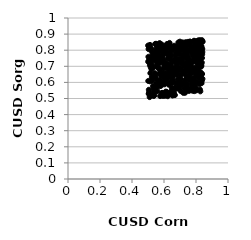
| Category | Series 0 |
|---|---|
| 0.789537141163253 | 0.546 |
| 0.7393209278989524 | 0.582 |
| 0.5146972384262045 | 0.657 |
| 0.8025821466182872 | 0.675 |
| 0.7553423103545773 | 0.713 |
| 0.6518374552992151 | 0.551 |
| 0.716653761533334 | 0.749 |
| 0.7913280189907017 | 0.842 |
| 0.5979593884945443 | 0.724 |
| 0.6924302068703907 | 0.794 |
| 0.6721062809417795 | 0.693 |
| 0.6343633907560136 | 0.784 |
| 0.7126194483507063 | 0.812 |
| 0.5954020792871302 | 0.658 |
| 0.7838053251334289 | 0.769 |
| 0.5831548302153797 | 0.641 |
| 0.6665365841519753 | 0.728 |
| 0.5408568572932027 | 0.774 |
| 0.7822607365205054 | 0.669 |
| 0.5972532858750963 | 0.739 |
| 0.5687135410672672 | 0.69 |
| 0.8086954234759687 | 0.732 |
| 0.6833786474103468 | 0.825 |
| 0.575823483311674 | 0.515 |
| 0.7512775900678096 | 0.564 |
| 0.5157013543859263 | 0.804 |
| 0.6257720732143637 | 0.748 |
| 0.6489855045192885 | 0.566 |
| 0.6496880024415178 | 0.55 |
| 0.643625241038317 | 0.712 |
| 0.8337201559222865 | 0.706 |
| 0.7409492055369735 | 0.594 |
| 0.6217054554742861 | 0.829 |
| 0.7963768174862137 | 0.557 |
| 0.7535535987557852 | 0.714 |
| 0.6586420130550489 | 0.658 |
| 0.807680028695077 | 0.64 |
| 0.7996050523855961 | 0.693 |
| 0.5791963725857388 | 0.761 |
| 0.7899514284050327 | 0.558 |
| 0.6170863241183342 | 0.539 |
| 0.696999464018413 | 0.774 |
| 0.8108554417359185 | 0.722 |
| 0.5592521472254736 | 0.546 |
| 0.673407103201527 | 0.782 |
| 0.6364854366401308 | 0.815 |
| 0.8019023742772847 | 0.55 |
| 0.7017172402778769 | 0.578 |
| 0.682590820111384 | 0.818 |
| 0.8255507794949901 | 0.737 |
| 0.7270235156668525 | 0.6 |
| 0.5835508032848437 | 0.823 |
| 0.5480344765651697 | 0.542 |
| 0.590976132361733 | 0.82 |
| 0.5080178996267478 | 0.743 |
| 0.5213319708328319 | 0.803 |
| 0.5585170846697625 | 0.732 |
| 0.727219435900885 | 0.823 |
| 0.8247338158405075 | 0.556 |
| 0.6407434502436964 | 0.762 |
| 0.7399629861713787 | 0.622 |
| 0.8203378696219645 | 0.64 |
| 0.5749204074095717 | 0.831 |
| 0.6471009726955761 | 0.613 |
| 0.5258403186809127 | 0.61 |
| 0.6884872854444603 | 0.572 |
| 0.7778725840772602 | 0.821 |
| 0.7719403527171453 | 0.655 |
| 0.7857166333493164 | 0.591 |
| 0.6579228734268394 | 0.602 |
| 0.7614068246514567 | 0.704 |
| 0.6230047715944955 | 0.778 |
| 0.7730864565297618 | 0.59 |
| 0.7591578467960547 | 0.613 |
| 0.6450855435140814 | 0.681 |
| 0.6286691533007386 | 0.535 |
| 0.747986817526133 | 0.705 |
| 0.7959635419356264 | 0.856 |
| 0.5195048153118826 | 0.811 |
| 0.5660370532559245 | 0.77 |
| 0.5093421625427896 | 0.735 |
| 0.7877308143223478 | 0.822 |
| 0.5674634064427115 | 0.809 |
| 0.5613703026136772 | 0.756 |
| 0.5719420304504657 | 0.72 |
| 0.5675779671727499 | 0.603 |
| 0.8322778754209412 | 0.65 |
| 0.5765796773158051 | 0.829 |
| 0.6253366417877969 | 0.635 |
| 0.7154265294037168 | 0.811 |
| 0.5016962133848333 | 0.609 |
| 0.7712719926138032 | 0.806 |
| 0.7572323442549609 | 0.841 |
| 0.8345911046278203 | 0.595 |
| 0.5860378547236758 | 0.835 |
| 0.8224486327946388 | 0.847 |
| 0.6418075506634328 | 0.529 |
| 0.724220812300675 | 0.836 |
| 0.6787454511188613 | 0.789 |
| 0.7333125306797498 | 0.696 |
| 0.5228472771427579 | 0.705 |
| 0.6760243627180262 | 0.687 |
| 0.543372627101915 | 0.633 |
| 0.7576616174536694 | 0.667 |
| 0.713827252726047 | 0.772 |
| 0.6300923187554525 | 0.586 |
| 0.7904861337532192 | 0.599 |
| 0.7247234132525657 | 0.669 |
| 0.6359512200970323 | 0.706 |
| 0.5555859263387691 | 0.823 |
| 0.6768518473513807 | 0.799 |
| 0.7632916115194517 | 0.679 |
| 0.8361713561107815 | 0.61 |
| 0.7186095118210329 | 0.707 |
| 0.7826198001580864 | 0.788 |
| 0.5738240237371401 | 0.607 |
| 0.522229076433828 | 0.68 |
| 0.7436753682812365 | 0.806 |
| 0.5694467603981398 | 0.594 |
| 0.5233217223801523 | 0.706 |
| 0.6055794496710558 | 0.517 |
| 0.8259875826886454 | 0.768 |
| 0.5546883763017978 | 0.83 |
| 0.6970743407092577 | 0.736 |
| 0.7566165155017609 | 0.636 |
| 0.7992659975486164 | 0.6 |
| 0.7196651382184569 | 0.661 |
| 0.8271957800808887 | 0.544 |
| 0.6426070367800769 | 0.825 |
| 0.6394822772287416 | 0.634 |
| 0.7626421155655152 | 0.854 |
| 0.734411382934531 | 0.801 |
| 0.5534244408105516 | 0.702 |
| 0.8281919239707146 | 0.597 |
| 0.7088443723876972 | 0.809 |
| 0.8199861684290868 | 0.775 |
| 0.6401429103923447 | 0.77 |
| 0.7025045353921959 | 0.602 |
| 0.746728014880554 | 0.729 |
| 0.7581663571935776 | 0.733 |
| 0.7507911358505414 | 0.852 |
| 0.6372755305705395 | 0.744 |
| 0.7173810607794494 | 0.659 |
| 0.7935086587236646 | 0.607 |
| 0.7149317985403314 | 0.73 |
| 0.6154269675054836 | 0.532 |
| 0.7361277163643768 | 0.85 |
| 0.6131144084233837 | 0.704 |
| 0.5302334103463762 | 0.628 |
| 0.6282488273001341 | 0.631 |
| 0.6099894606985351 | 0.792 |
| 0.5708010144974307 | 0.578 |
| 0.5125394888278862 | 0.833 |
| 0.7178824865773556 | 0.716 |
| 0.6449624632456418 | 0.694 |
| 0.677701555558522 | 0.814 |
| 0.7886346470031298 | 0.753 |
| 0.501015685375253 | 0.729 |
| 0.7659417452105861 | 0.698 |
| 0.8004567309422825 | 0.655 |
| 0.5043896243421815 | 0.53 |
| 0.7761600594016458 | 0.569 |
| 0.6982249758776872 | 0.792 |
| 0.7770443676625121 | 0.782 |
| 0.5823176648096522 | 0.824 |
| 0.5293232185321834 | 0.634 |
| 0.6623106509693579 | 0.538 |
| 0.8365377168351142 | 0.723 |
| 0.5500247197642468 | 0.84 |
| 0.8404298894487359 | 0.622 |
| 0.8302343059578688 | 0.757 |
| 0.7280562744120243 | 0.562 |
| 0.7052163806409246 | 0.622 |
| 0.5883584156752549 | 0.789 |
| 0.814812190026081 | 0.709 |
| 0.7849867627304555 | 0.73 |
| 0.5396863462382026 | 0.52 |
| 0.6609840372955875 | 0.663 |
| 0.7225769808817138 | 0.701 |
| 0.6615694642950851 | 0.739 |
| 0.7804333124404206 | 0.618 |
| 0.6707992627941833 | 0.568 |
| 0.5102409027126322 | 0.821 |
| 0.7690451302396976 | 0.813 |
| 0.7619484803774603 | 0.799 |
| 0.6378902395056195 | 0.786 |
| 0.5511583664545938 | 0.593 |
| 0.6271628713404449 | 0.525 |
| 0.7670833033895674 | 0.85 |
| 0.7300021073221883 | 0.717 |
| 0.6046075290501778 | 0.593 |
| 0.5702450708924186 | 0.654 |
| 0.5722356065049252 | 0.744 |
| 0.5134334107048619 | 0.606 |
| 0.5810489904550544 | 0.823 |
| 0.6384709155846835 | 0.812 |
| 0.6186296199921117 | 0.639 |
| 0.7832609581420303 | 0.688 |
| 0.7989352083779209 | 0.793 |
| 0.812688064621234 | 0.694 |
| 0.7650897692764829 | 0.735 |
| 0.6068793432318736 | 0.646 |
| 0.7498929052159753 | 0.68 |
| 0.6120349753517347 | 0.722 |
| 0.5169431667872195 | 0.693 |
| 0.5420872220308097 | 0.637 |
| 0.6235870093073029 | 0.514 |
| 0.5422605610858657 | 0.658 |
| 0.7260380441251993 | 0.762 |
| 0.7116958134653328 | 0.651 |
| 0.5077893646532936 | 0.816 |
| 0.767893875161042 | 0.71 |
| 0.650373331584239 | 0.734 |
| 0.598786939241255 | 0.781 |
| 0.695608895007974 | 0.691 |
| 0.82535017237486 | 0.665 |
| 0.5104788671468552 | 0.509 |
| 0.7320293709174297 | 0.536 |
| 0.6269588786217475 | 0.75 |
| 0.593083062892082 | 0.767 |
| 0.5350707556940748 | 0.764 |
| 0.6294453702593112 | 0.674 |
| 0.7040968136256662 | 0.677 |
| 0.6533779649164462 | 0.519 |
| 0.7942106823003154 | 0.587 |
| 0.811901963147115 | 0.696 |
| 0.7104740438861703 | 0.583 |
| 0.693133057427636 | 0.603 |
| 0.7921355056519706 | 0.573 |
| 0.6892237066591924 | 0.786 |
| 0.7004566094279603 | 0.795 |
| 0.5308072251341074 | 0.763 |
| 0.5878246704918391 | 0.534 |
| 0.7457421732222543 | 0.639 |
| 0.6875049544639892 | 0.621 |
| 0.6015842296174445 | 0.705 |
| 0.5610861855862372 | 0.785 |
| 0.5486175619525406 | 0.797 |
| 0.8307150512817066 | 0.773 |
| 0.7889646714209345 | 0.771 |
| 0.5898890208474401 | 0.728 |
| 0.7682190639148487 | 0.673 |
| 0.5206159518238059 | 0.749 |
| 0.5944197797454747 | 0.599 |
| 0.5769503188403247 | 0.614 |
| 0.5443798624577283 | 0.573 |
| 0.5387178807052888 | 0.781 |
| 0.6572891983003302 | 0.613 |
| 0.505137078765321 | 0.554 |
| 0.5024680753734336 | 0.759 |
| 0.7415167907407327 | 0.769 |
| 0.6914305278073793 | 0.615 |
| 0.534198398019456 | 0.565 |
| 0.6204361340329394 | 0.815 |
| 0.8288236153589748 | 0.76 |
| 0.7369203330463815 | 0.802 |
| 0.538099366126239 | 0.751 |
| 0.8011450774957143 | 0.848 |
| 0.8105242713615359 | 0.838 |
| 0.7292228330643074 | 0.79 |
| 0.8358139794247456 | 0.806 |
| 0.816563368010178 | 0.757 |
| 0.580207523896829 | 0.795 |
| 0.6316776881528324 | 0.656 |
| 0.5371866346769926 | 0.737 |
| 0.6687148511904183 | 0.563 |
| 0.6567939707349895 | 0.638 |
| 0.7209976358971026 | 0.535 |
| 0.7135983798827182 | 0.843 |
| 0.7696541728498524 | 0.615 |
| 0.7157272758945765 | 0.849 |
| 0.6172562919259493 | 0.539 |
| 0.5263219179213916 | 0.786 |
| 0.7813322103951235 | 0.548 |
| 0.8034618510051994 | 0.828 |
| 0.6135469142534808 | 0.626 |
| 0.7101028762311821 | 0.582 |
| 0.8082577811232756 | 0.639 |
| 0.7930110556401346 | 0.742 |
| 0.8315888311006657 | 0.635 |
| 0.5531132017462612 | 0.621 |
| 0.5640164770073358 | 0.816 |
| 0.740755864883649 | 0.705 |
| 0.8138927524118643 | 0.818 |
| 0.5965798767691801 | 0.686 |
| 0.6905536117521336 | 0.573 |
| 0.6989193945286931 | 0.748 |
| 0.6782873171751561 | 0.703 |
| 0.5887587360960318 | 0.535 |
| 0.545096536696138 | 0.839 |
| 0.5181168736858328 | 0.735 |
| 0.5563498425888556 | 0.723 |
| 0.7948384877299103 | 0.785 |
| 0.6485331080822354 | 0.607 |
| 0.707040865868648 | 0.719 |
| 0.6723104222854052 | 0.752 |
| 0.7308092922984819 | 0.756 |
| 0.5277218957704807 | 0.748 |
| 0.8299161022661221 | 0.72 |
| 0.5311810440695621 | 0.577 |
| 0.6162599047138804 | 0.789 |
| 0.7326922975353685 | 0.705 |
| 0.6812268205595059 | 0.648 |
| 0.6798712123164434 | 0.822 |
| 0.5184395433749904 | 0.722 |
| 0.820841176408082 | 0.588 |
| 0.8188985142541382 | 0.627 |
| 0.8396653941332525 | 0.789 |
| 0.8171376598364926 | 0.739 |
| 0.8132403407792173 | 0.861 |
| 0.7559537005015777 | 0.547 |
| 0.7064923509611757 | 0.733 |
| 0.6515978628646515 | 0.688 |
| 0.619877284833922 | 0.686 |
| 0.5116384102169871 | 0.707 |
| 0.5138558575832506 | 0.752 |
| 0.72195636492609 | 0.595 |
| 0.7983077541737953 | 0.648 |
| 0.8401326443252485 | 0.852 |
| 0.6021195898072189 | 0.822 |
| 0.5239760149762042 | 0.632 |
| 0.7722807887619956 | 0.55 |
| 0.7232868499769498 | 0.809 |
| 0.6240934413111874 | 0.713 |
| 0.5797529875715566 | 0.578 |
| 0.7337505091867687 | 0.613 |
| 0.5345826574834631 | 0.546 |
| 0.8231493107431219 | 0.742 |
| 0.760874810361585 | 0.728 |
| 0.7518745549436666 | 0.756 |
| 0.7037596612497005 | 0.685 |
| 0.8371061056063369 | 0.862 |
| 0.5005654408318474 | 0.829 |
| 0.6600261468371134 | 0.686 |
| 0.6655703554853698 | 0.523 |
| 0.6188464155712632 | 0.838 |
| 0.7213733608617222 | 0.664 |
| 0.8376254118775233 | 0.752 |
| 0.8290088863347889 | 0.855 |
| 0.6866084537307862 | 0.562 |
| 0.655859259045968 | 0.549 |
| 0.6028599353701174 | 0.588 |
| 0.5778004885046151 | 0.672 |
| 0.8149097894305937 | 0.688 |
| 0.5035709114777457 | 0.807 |
| 0.8070455716759641 | 0.779 |
| 0.8343825575344785 | 0.653 |
| 0.6803238877647404 | 0.732 |
| 0.7595134728547416 | 0.844 |
| 0.550274464401461 | 0.803 |
| 0.6217501567726843 | 0.773 |
| 0.6461457087190123 | 0.595 |
| 0.6348514102882601 | 0.845 |
| 0.6084930386406241 | 0.656 |
| 0.8192868320233158 | 0.795 |
| 0.7783480602052675 | 0.777 |
| 0.6113945756898719 | 0.804 |
| 0.6943933388688436 | 0.782 |
| 0.6529179606617319 | 0.521 |
| 0.6056979474012236 | 0.698 |
| 0.6848714705276597 | 0.824 |
| 0.8015582336093101 | 0.761 |
| 0.7289067495823759 | 0.773 |
| 0.5622284064939066 | 0.836 |
| 0.7702812009293001 | 0.695 |
| 0.8033983214234028 | 0.723 |
| 0.6107656759838829 | 0.543 |
| 0.7057501357201889 | 0.546 |
| 0.5645974943306735 | 0.827 |
| 0.7491960113879528 | 0.789 |
| 0.6917449551751924 | 0.805 |
| 0.8276715674720829 | 0.71 |
| 0.764799815398711 | 0.833 |
| 0.6433917746198824 | 0.637 |
| 0.8325839292006654 | 0.698 |
| 0.5957830175324024 | 0.6 |
| 0.6755465129170561 | 0.595 |
| 0.7862526788101084 | 0.795 |
| 0.8055068218552915 | 0.604 |
| 0.5934660374426435 | 0.516 |
| 0.7796131888918132 | 0.764 |
| 0.6744980171013388 | 0.681 |
| 0.6682844089184725 | 0.564 |
| 0.8040624721982079 | 0.599 |
| 0.5730330248982907 | 0.844 |
| 0.663483374175547 | 0.828 |
| 0.8221742857258698 | 0.832 |
| 0.5476056374957843 | 0.773 |
| 0.7754581525567357 | 0.573 |
| 0.8392207373883781 | 0.808 |
| 0.8094765911449644 | 0.813 |
| 0.5922345049980708 | 0.661 |
| 0.6474579633067048 | 0.767 |
| 0.7768302206504119 | 0.733 |
| 0.7544998921006918 | 0.689 |
| 0.786887759064523 | 0.626 |
| 0.7640462771385799 | 0.683 |
| 0.5165512430964073 | 0.723 |
| 0.5360847798916163 | 0.515 |
| 0.7807273047009422 | 0.805 |
| 0.7749783103177902 | 0.624 |
| 0.8331184289387845 | 0.658 |
| 0.6549505387521527 | 0.8 |
| 0.8350421778859363 | 0.821 |
| 0.6859579806184146 | 0.669 |
| 0.7663724314223361 | 0.718 |
| 0.8177862941701423 | 0.842 |
| 0.7540287822068092 | 0.748 |
| 0.7200405575950605 | 0.797 |
| 0.667676076606502 | 0.521 |
| 0.552387216111887 | 0.569 |
| 0.7442838691388534 | 0.768 |
| 0.604081285321407 | 0.644 |
| 0.608928945576837 | 0.634 |
| 0.7385924061333593 | 0.821 |
| 0.8238578367821685 | 0.863 |
| 0.7255112937219836 | 0.603 |
| 0.792575670625725 | 0.846 |
| 0.821348189171077 | 0.758 |
| 0.6649120072510374 | 0.684 |
| 0.8046421024533167 | 0.674 |
| 0.5065103618331985 | 0.539 |
| 0.6960898931023682 | 0.569 |
| 0.7474115934583401 | 0.722 |
| 0.5467928323819594 | 0.565 |
| 0.6818868608789497 | 0.564 |
| 0.5253352901702142 | 0.764 |
| 0.773883473217598 | 0.607 |
| 0.7603668213685014 | 0.686 |
| 0.7967468101681756 | 0.679 |
| 0.6705602813345477 | 0.566 |
| 0.6309182357433218 | 0.663 |
| 0.8310479566002458 | 0.826 |
| 0.6325658895445669 | 0.599 |
| 0.8266888472407585 | 0.799 |
| 0.7006261887138281 | 0.646 |
| 0.7842778855332349 | 0.82 |
| 0.6659732911961607 | 0.809 |
| 0.6693854136913613 | 0.561 |
| 0.6994968517177692 | 0.853 |
| 0.7978472162532757 | 0.564 |
| 0.7374869270186959 | 0.645 |
| 0.8164663854506397 | 0.851 |
| 0.6896129679642443 | 0.848 |
| 0.5579749556458715 | 0.583 |
| 0.8056581221452149 | 0.814 |
| 0.7873914650139319 | 0.859 |
| 0.7793454863912508 | 0.566 |
| 0.6334950040387688 | 0.809 |
| 0.5320665774426665 | 0.692 |
| 0.5597604347093685 | 0.714 |
| 0.6936607614974919 | 0.587 |
| 0.5058655571533703 | 0.529 |
| 0.7493934186874354 | 0.553 |
| 0.8387690499716574 | 0.775 |
| 0.5840419248153067 | 0.607 |
| 0.8157624935827636 | 0.821 |
| 0.6541272166461876 | 0.672 |
| 0.6641038199385962 | 0.734 |
| 0.7744218546165372 | 0.796 |
| 0.7030388593112695 | 0.824 |
| 0.5402943534428464 | 0.766 |
| 0.607506174513098 | 0.795 |
| 0.6140948824893664 | 0.617 |
| 0.6853888022552872 | 0.567 |
| 0.5328351599906361 | 0.751 |
| 0.8410056060395921 | 0.855 |
| 0.7353356687600429 | 0.669 |
| 0.7428454406025613 | 0.828 |
| 0.6003997663573484 | 0.627 |
| 0.5864733424346917 | 0.643 |
| 0.8184514977683318 | 0.639 |
| 0.6594015734738186 | 0.682 |
| 0.8234092256734673 | 0.834 |
| 0.746220387298123 | 0.589 |
| 0.744791945930634 | 0.635 |
| 0.6002483614717703 | 0.804 |
| 0.7085156453134214 | 0.826 |
| 0.6839079493313234 | 0.714 |
| 0.7706952622317517 | 0.562 |
| 0.5281190398108249 | 0.521 |
| 0.5570222706826367 | 0.744 |
| 0.5653082994213927 | 0.836 |
| 0.5460084718126278 | 0.644 |
| 0.7317011980613475 | 0.844 |
| 0.7076990167473598 | 0.836 |
| 0.8114551726119582 | 0.816 |
| 0.7422622255618085 | 0.776 |
| 0.7382118330031835 | 0.75 |
| 0.7111180119437281 | 0.736 |
| 0.8062313878890663 | 0.751 |
| 0.674135390663121 | 0.771 |
| 0.8096214170149771 | 0.742 |
| 0.5852921103066097 | 0.64 |
| 0.5906997642665537 | 0.752 |
| 0.8381530388490658 | 0.652 |
| 0.7528427078964053 | 0.643 |
| 0.8133816512580974 | 0.647 |
| 0.7954787818687489 | 0.836 |
| 0.5634001675840955 | 0.689 |